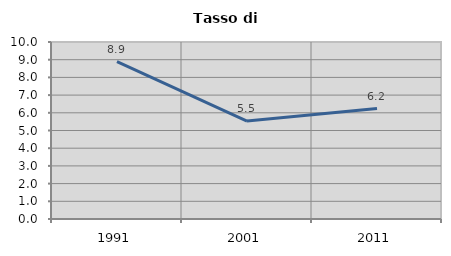
| Category | Tasso di disoccupazione   |
|---|---|
| 1991.0 | 8.895 |
| 2001.0 | 5.531 |
| 2011.0 | 6.241 |